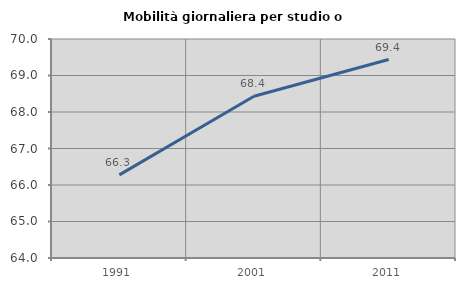
| Category | Mobilità giornaliera per studio o lavoro |
|---|---|
| 1991.0 | 66.277 |
| 2001.0 | 68.43 |
| 2011.0 | 69.438 |